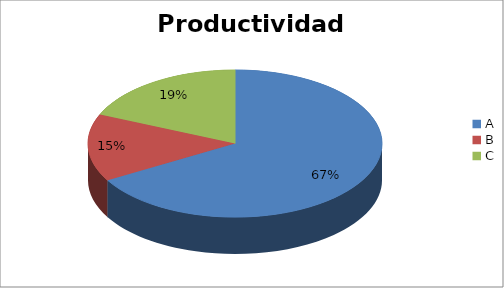
| Category | Series 0 |
|---|---|
| A | 66.667 |
| B | 14.815 |
| C | 18.519 |